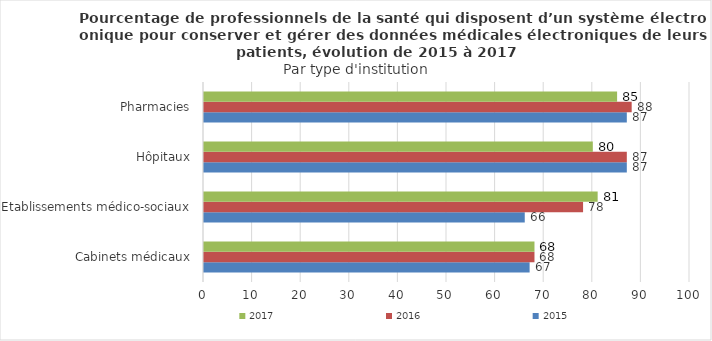
| Category | 2015 | 2016 | 2017 |
|---|---|---|---|
| Cabinets médicaux | 67 | 68 | 68 |
| Etablissements médico-sociaux | 66 | 78 | 81 |
| Hôpitaux | 87 | 87 | 80 |
| Pharmacies | 87 | 88 | 85 |